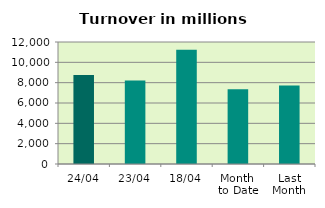
| Category | Series 0 |
|---|---|
| 24/04 | 8757.263 |
| 23/04 | 8202.867 |
| 18/04 | 11245.358 |
| Month 
to Date | 7349.046 |
| Last
Month | 7711.184 |